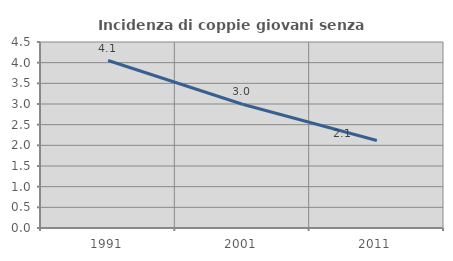
| Category | Incidenza di coppie giovani senza figli |
|---|---|
| 1991.0 | 4.052 |
| 2001.0 | 2.993 |
| 2011.0 | 2.119 |